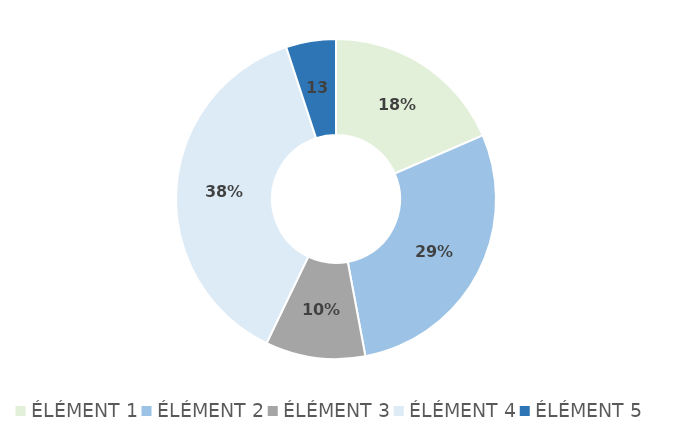
| Category | Series 0 |
|---|---|
| ÉLÉMENT 1 | 22 |
| ÉLÉMENT 2 | 34 |
| ÉLÉMENT 3 | 12 |
| ÉLÉMENT 4 | 45 |
| ÉLÉMENT 5 | 6 |